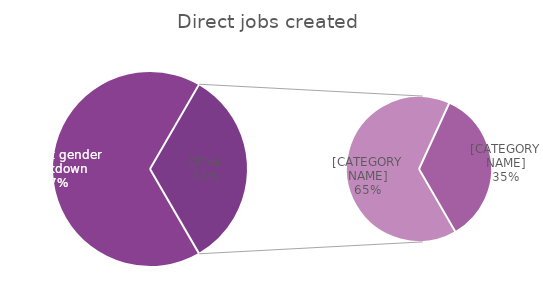
| Category | Direct jobs created |
|---|---|
| Without gender breakdown | 1787235 |
| Male | 581028 |
| Female | 310082 |